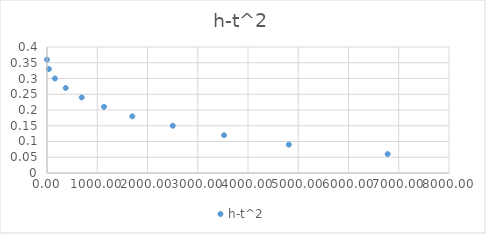
| Category | h-t^2 |
|---|---|
| 0.0 | 0.36 |
| 38.564099999999996 | 0.33 |
| 157.25159999999997 | 0.3 |
| 372.49 | 0.27 |
| 690.6384 | 0.24 |
| 1134.3424 | 0.21 |
| 1698.2641 | 0.18 |
| 2502.0004000000004 | 0.15 |
| 3523.6096 | 0.12 |
| 4812.196900000001 | 0.09 |
| 6779.8756 | 0.06 |